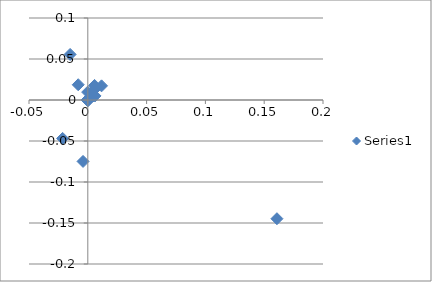
| Category | Series 0 |
|---|---|
| -1.58157917529567e-05 | 0 |
| 4.05390292705349e-06 | 0 |
| -1.05215990324983e-05 | 0 |
| 1.68615646805574e-05 | 0 |
| -1.17886697756674e-06 | 0 |
| -7.55706550698772e-07 | 0 |
| 5.90445227069818e-06 | 0 |
| 6.53926932344408e-07 | 0 |
| 1.10029624844448e-05 | 0 |
| -3.15597556152674e-05 | 0 |
| -9.61046216401938e-08 | 0 |
| -3.17182351592088e-06 | 0.001 |
| 1.74806267957089e-05 | 0 |
| 5.12844230894347e-06 | 0 |
| 3.69297001398739e-06 | 0 |
| -3.1103981164398e-06 | 0 |
| 2.6013768484943e-05 | 0 |
| -0.000372254077271737 | 0 |
| 4.81982672833761e-05 | 0 |
| -3.57669399776808e-07 | 0 |
| 0.000152198455841208 | 0 |
| -3.5079806999747e-05 | 0 |
| -3.66405984358709e-06 | 0 |
| 5.02449167100174e-06 | 0 |
| -3.18950801490097e-06 | 0 |
| 2.66235088738417e-06 | 0 |
| 7.83240200906255e-06 | 0 |
| 3.52570536828859e-05 | 0 |
| -1.60629776363774e-05 | 0 |
| -1.4654346678687e-05 | 0 |
| 1.08171575015248e-05 | 0 |
| 4.84525805808389e-06 | -0.001 |
| 6.01429576764174e-06 | 0 |
| 1.06230326731029e-05 | 0 |
| 7.23340181058749e-06 | 0 |
| -9.62795957689386e-06 | 0 |
| 4.33192178229284e-05 | 0 |
| -9.25461850668934e-06 | 0 |
| 3.4189874262321e-05 | 0 |
| 2.20889858156512e-05 | 0 |
| 3.05890362390866e-06 | 0 |
| -1.00374532338063e-06 | 0 |
| 6.29091813869905e-06 | 0 |
| 5.78614195888863e-06 | 0 |
| 1.75983559024746e-05 | 0 |
| -6.02764724315289e-05 | 0 |
| 1.04220668202899e-05 | 0 |
| 2.14653132414088e-06 | 0 |
| 7.20802250468021e-06 | 0 |
| -8.32333089257713e-06 | 0 |
| 3.26684811540499e-06 | 0 |
| -1.94358979158708e-05 | 0 |
| -7.87859501077849e-05 | 0 |
| 3.709261633408e-06 | 0 |
| 8.11607920140573e-06 | 0 |
| -1.91291063007313e-05 | 0 |
| -9.45038410849997e-06 | 0 |
| 1.4596273507956e-05 | 0 |
| -1.22023129948063e-05 | 0 |
| -2.04889021939497e-06 | 0 |
| 3.95521705275746e-06 | 0 |
| 6.50047867596894e-06 | 0 |
| -3.98743792807741e-06 | 0 |
| 9.87170712402169e-06 | 0 |
| -7.16193314084799e-06 | 0 |
| -3.1246340291127e-05 | 0 |
| 3.24202750267793e-06 | 0 |
| -1.0109990426355e-06 | 0 |
| 1.78661962186322e-06 | 0 |
| -3.74793739760858e-07 | 0 |
| -1.03684260858716e-06 | 0 |
| 3.69380308325187e-06 | 0 |
| 3.45585727855786e-07 | 0 |
| 5.38527499123574e-07 | 0 |
| 1.69341440088269e-05 | 0 |
| 2.33556748453596e-06 | 0 |
| -3.35204103823768e-06 | 0 |
| -1.76270862240925e-06 | 0 |
| 6.78046781098205e-06 | 0 |
| -4.83218596884796e-06 | 0 |
| 4.58255309410723e-07 | 0 |
| 6.26775943869212e-07 | 0 |
| -2.38883762134295e-06 | 0 |
| -0.000174300240034728 | 0 |
| 1.94599396468641e-06 | 0 |
| 1.19033412162556e-08 | 0 |
| 4.5425700447858e-07 | 0 |
| -1.92771956086561e-05 | 0 |
| -8.93946640604783e-06 | 0 |
| -6.22036116919679e-08 | 0 |
| 6.42995319622469e-07 | 0 |
| -8.63510682674367e-07 | 0 |
| -1.43604521080802e-05 | 0 |
| -1.46872464435194e-06 | 0 |
| -3.16667798882346e-07 | 0 |
| 1.30321645748221e-06 | 0 |
| 7.17791533745824e-06 | 0 |
| 1.77723939727965e-06 | 0 |
| -1.24158477448951e-06 | 0 |
| 1.06711474688131e-06 | 0 |
| 9.2522651746003e-07 | 0 |
| 2.35702333629496e-06 | 0 |
| -7.65958965690653e-07 | 0 |
| 4.68780860356175e-08 | 0 |
| 9.37350562060701e-07 | 0 |
| 6.35961351363541e-06 | 0 |
| 5.40878005395657e-07 | 0 |
| 4.51397020460791e-07 | 0 |
| 1.13073096514386e-06 | 0 |
| 1.87232077264076e-06 | 0 |
| 1.11302965326067e-07 | 0 |
| 1.14484405754323e-06 | 0 |
| 2.20518235096215e-07 | 0 |
| -1.04854139383057e-07 | 0 |
| 4.44676874595873e-07 | 0 |
| -2.26725889915858e-07 | 0 |
| 2.32479424907043e-07 | 0 |
| 6.62597591958514e-07 | 0 |
| 3.24637712465975e-07 | 0 |
| 1.26388636112326e-06 | 0 |
| 2.7758329568128e-07 | 0 |
| 1.33515242252679e-08 | 0 |
| 3.85727141251216e-07 | 0 |
| 5.31841314878003e-07 | 0 |
| -2.5894450640975e-07 | 0 |
| 5.90508464184546e-08 | 0 |
| 1.78036203741374e-07 | 0 |
| -5.62028462034482e-06 | 0 |
| -2.62959661945405e-07 | 0 |
| 2.54940601162998e-07 | 0 |
| 4.49009243998791e-08 | 0 |
| 3.7499323452363e-07 | 0 |
| 8.57935486973035e-08 | 0 |
| 8.69412518685421e-07 | 0 |
| -3.34009131303797e-07 | 0 |
| 1.63490755229161e-06 | 0 |
| -1.21203322066409e-05 | 0 |
| 0.000111806164277991 | 0 |
| -0.0150209382745881 | 0.056 |
| -0.00813626734075817 | 0.019 |
| 0.00611499196117084 | 0.005 |
| 0.00448427009440184 | 0.005 |
| 0.0056020565494068 | 0.013 |
| -0.000116451156532883 | 0.01 |
| 0.0116913417156186 | 0.017 |
| 2.76917861647041e-05 | 0 |
| 0.00574232380237403 | 0.018 |
| 4.02356453534554e-05 | 0 |
| 1.35549948636066e-05 | 0 |
| 1.12356899937154e-05 | 0 |
| -2.94295164352187e-05 | 0 |
| -7.19761622411351e-06 | 0 |
| 1.0309521789388e-06 | 0 |
| 3.51772946798869e-05 | 0 |
| -0.0214017179664724 | -0.047 |
| -1.45662045137762e-05 | 0 |
| -2.21393871631702e-05 | 0 |
| 5.10403773630071e-05 | 0 |
| 2.70138467649838e-05 | 0 |
| 2.82215690185285e-05 | 0 |
| 1.04311275994613e-05 | 0 |
| -3.07420472634498e-07 | 0 |
| -1.28390409671083e-05 | 0 |
| -2.05206759653173e-05 | 0 |
| -2.35152492414267e-05 | 0 |
| -0.00402895670070459 | -0.075 |
| -2.71025174762733e-05 | 0 |
| -2.98829083515162e-05 | 0 |
| -1.90406386634405e-06 | 0 |
| 0.160838423471344 | -0.145 |
| 2.19014599302949e-05 | 0 |
| -3.08704365881638e-05 | 0 |
| 5.65486092886463e-05 | 0 |
| -0.000281235427508003 | 0 |
| 4.26585954585961e-06 | 0 |
| 2.56947995469218e-05 | 0 |
| -0.000188929652274647 | 0 |
| -3.00786578074354e-05 | 0 |
| -1.50087226488307e-05 | 0 |
| 4.08676858763778e-05 | 0 |
| 2.99911526609179e-05 | 0 |
| 0.00028830113774744 | 0 |
| -0.000302001745794921 | 0 |
| 6.42901637679647e-06 | 0 |
| -1.86287737117253e-05 | 0 |
| 1.78015378252743e-05 | 0 |
| 5.18858951812025e-05 | 0 |
| 0.000458105082232897 | 0 |
| -7.19448260448156e-06 | 0 |
| -4.72395516888122e-06 | 0 |
| 2.653679550851e-05 | 0 |
| 2.8993387413159e-06 | 0 |
| -1.05121320849886e-06 | 0 |